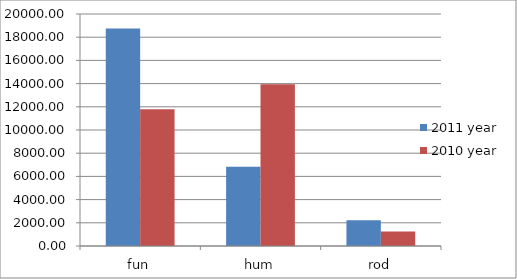
| Category | 2011 year | 2010 year |
|---|---|---|
| fun | 18754 | 11791 |
| hum | 6836 | 13949 |
| rod | 2218 | 1258 |